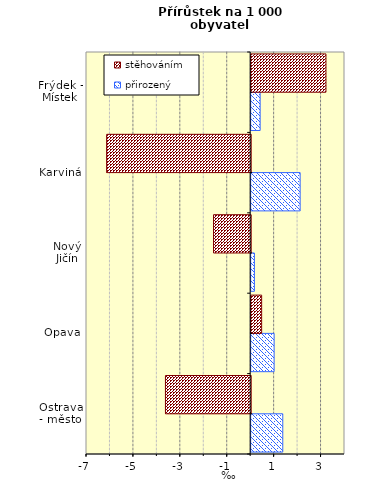
| Category | přirozený | stěhováním |
|---|---|---|
| Ostrava - město | 1.347 | -3.633 |
| Opava | 0.977 | 0.446 |
| Nový Jičín | 0.138 | -1.585 |
| Karviná | 2.088 | -6.141 |
| Frýdek - Místek | 0.382 | 3.188 |